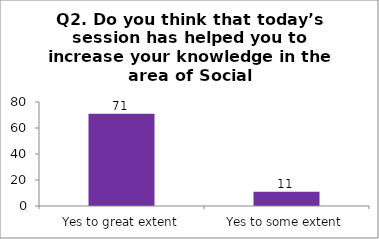
| Category | Q2. Do you think that today’s session have helped you to increase your knowledge in the area of Social Entrepreneurship? |
|---|---|
| Yes to great extent | 71 |
| Yes to some extent | 11 |